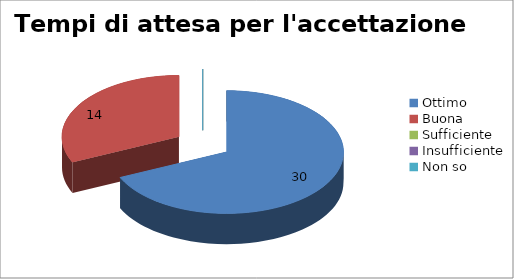
| Category | Tempi di attesa per l'accettazione |
|---|---|
| Ottimo | 30 |
| Buona | 14 |
| Sufficiente | 0 |
| Insufficiente | 0 |
| Non so | 0 |